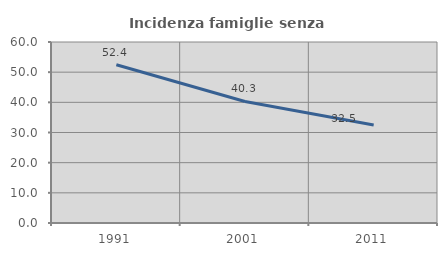
| Category | Incidenza famiglie senza nuclei |
|---|---|
| 1991.0 | 52.439 |
| 2001.0 | 40.278 |
| 2011.0 | 32.468 |